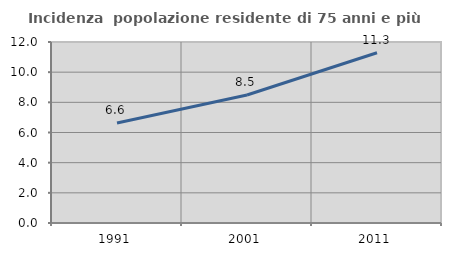
| Category | Incidenza  popolazione residente di 75 anni e più |
|---|---|
| 1991.0 | 6.635 |
| 2001.0 | 8.489 |
| 2011.0 | 11.285 |